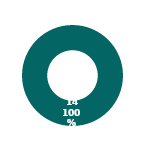
| Category | CPM |
|---|---|
| MIL 2 Complete | 14 |
| MIL 2 Not Complete | 0 |